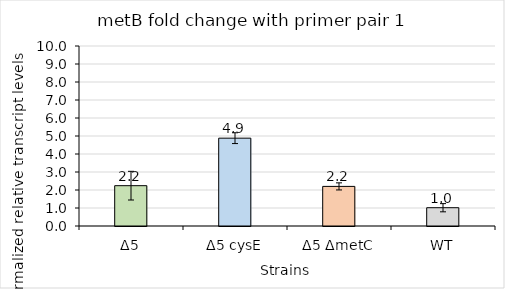
| Category | Δ5 Δ5 cysE Δ5 ΔmetC WT |
|---|---|
| Δ5 | 2.24 |
| Δ5 cysE | 4.88 |
| Δ5 ΔmetC | 2.2 |
| WT | 1.016 |